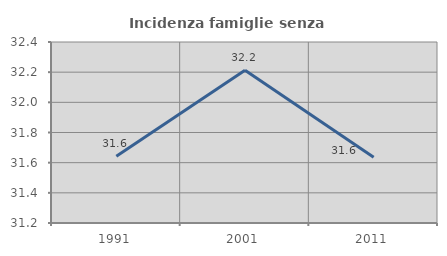
| Category | Incidenza famiglie senza nuclei |
|---|---|
| 1991.0 | 31.642 |
| 2001.0 | 32.213 |
| 2011.0 | 31.635 |